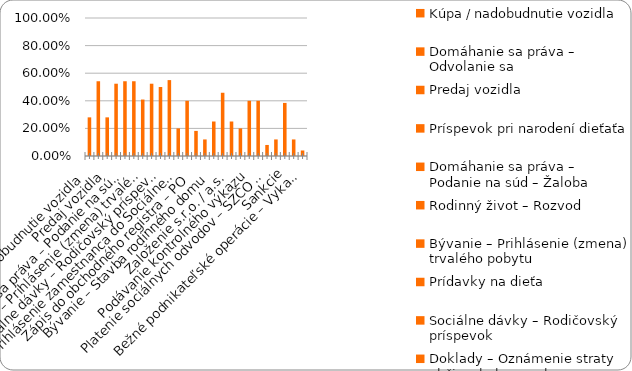
| Category | % |
|---|---|
| Kúpa / nadobudnutie vozidla | 0.28 |
| Domáhanie sa práva – Odvolanie sa | 0.542 |
| Predaj vozidla | 0.28 |
| Príspevok pri narodení dieťaťa | 0.524 |
| Domáhanie sa práva – Podanie na súd – Žaloba | 0.542 |
| Rodinný život – Rozvod | 0.542 |
| Bývanie – Prihlásenie (zmena) trvalého pobytu | 0.409 |
| Prídavky na dieťa | 0.524 |
| Sociálne dávky – Rodičovský príspevok | 0.5 |
| Doklady – Oznámenie straty občianskeho preukazu | 0.55 |
| Prihlásenie zamestnanca do Sociálnej poisťovne | 0.2 |
| Plnenie si daňových povinností – zamestnanec (FO) | 0.4 |
| Zápis do obchodného registra – PO | 0.182 |
| Živnosť - ukončenie | 0.12 |
| Bývanie – Stavba rodinného domu | 0.25 |
| Sociálne dávky – Príspevok v nezamestnanosti | 0.458 |
| Založenie s.r.o. / a.s. | 0.25 |
| Živnosť – založenie | 0.2 |
| Podávanie kontrolného výkazu | 0.4 |
| Plnenie si daňových povinností – SZČO / PO  | 0.4 |
| Platenie sociálnych odvodov – SZČO / PO | 0.08 |
| Živnosť - prerušenie | 0.12 |
| Sankcie | 0.385 |
| Živnosť - zmena | 0.12 |
| Bežné podnikateľské operácie – Vykazovanie štatistík | 0.04 |